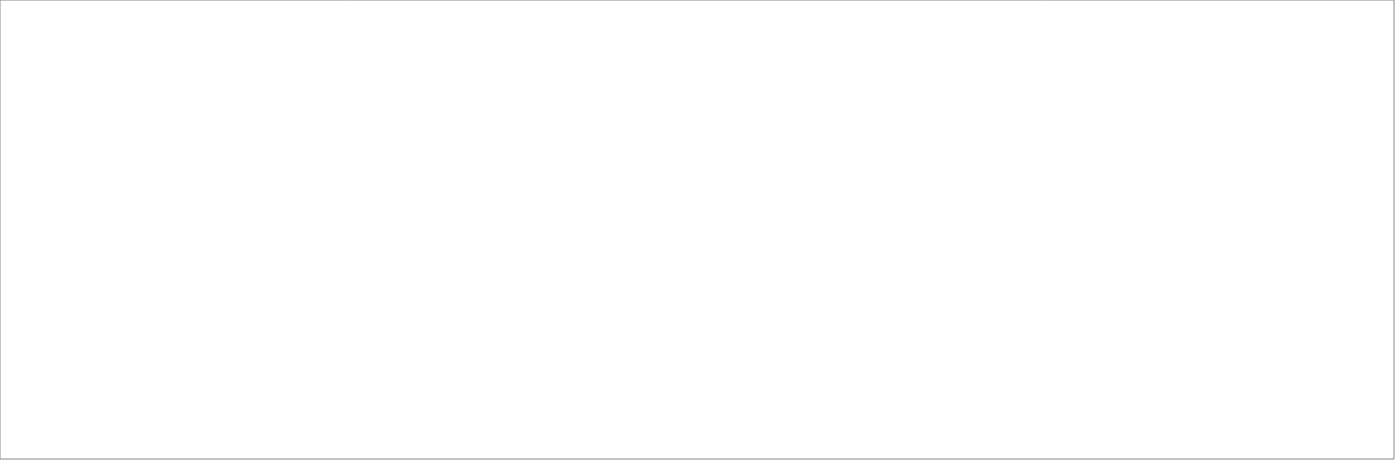
| Category | Enseñanza |
|---|---|
| 2018_I | 4151.453 |
| 2018_II | 3977.681 |
| 2018_III | 4808.926 |
| 2018_IV | 5130.793 |
| 2019_I | 4334.755 |
| 2019_II | 4397.013 |
| 2019_III | 0 |
| 2019_IV | 0 |